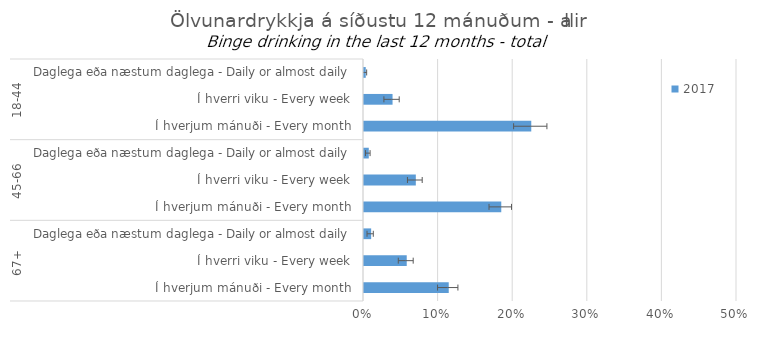
| Category | 2017 |
|---|---|
| 0 | 0.002 |
| 1 | 0.038 |
| 2 | 0.224 |
| 3 | 0.006 |
| 4 | 0.069 |
| 5 | 0.184 |
| 6 | 0.01 |
| 7 | 0.057 |
| 8 | 0.114 |